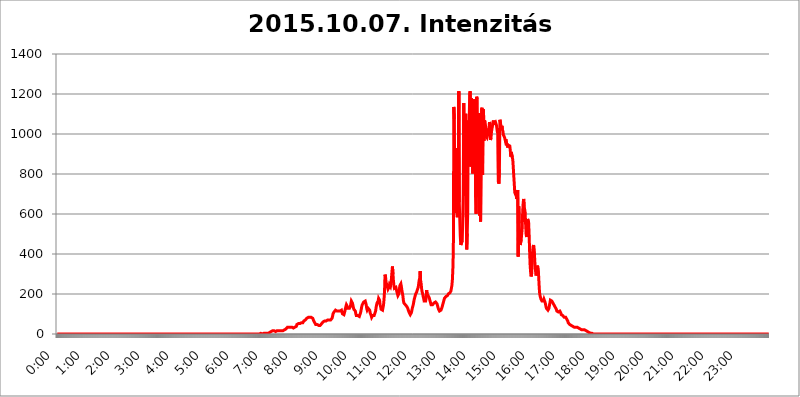
| Category | 2015.10.07. Intenzitás [W/m^2] |
|---|---|
| 0.0 | 0 |
| 0.0006944444444444445 | 0 |
| 0.001388888888888889 | 0 |
| 0.0020833333333333333 | 0 |
| 0.002777777777777778 | 0 |
| 0.003472222222222222 | 0 |
| 0.004166666666666667 | 0 |
| 0.004861111111111111 | 0 |
| 0.005555555555555556 | 0 |
| 0.0062499999999999995 | 0 |
| 0.006944444444444444 | 0 |
| 0.007638888888888889 | 0 |
| 0.008333333333333333 | 0 |
| 0.009027777777777779 | 0 |
| 0.009722222222222222 | 0 |
| 0.010416666666666666 | 0 |
| 0.011111111111111112 | 0 |
| 0.011805555555555555 | 0 |
| 0.012499999999999999 | 0 |
| 0.013194444444444444 | 0 |
| 0.013888888888888888 | 0 |
| 0.014583333333333332 | 0 |
| 0.015277777777777777 | 0 |
| 0.015972222222222224 | 0 |
| 0.016666666666666666 | 0 |
| 0.017361111111111112 | 0 |
| 0.018055555555555557 | 0 |
| 0.01875 | 0 |
| 0.019444444444444445 | 0 |
| 0.02013888888888889 | 0 |
| 0.020833333333333332 | 0 |
| 0.02152777777777778 | 0 |
| 0.022222222222222223 | 0 |
| 0.02291666666666667 | 0 |
| 0.02361111111111111 | 0 |
| 0.024305555555555556 | 0 |
| 0.024999999999999998 | 0 |
| 0.025694444444444447 | 0 |
| 0.02638888888888889 | 0 |
| 0.027083333333333334 | 0 |
| 0.027777777777777776 | 0 |
| 0.02847222222222222 | 0 |
| 0.029166666666666664 | 0 |
| 0.029861111111111113 | 0 |
| 0.030555555555555555 | 0 |
| 0.03125 | 0 |
| 0.03194444444444445 | 0 |
| 0.03263888888888889 | 0 |
| 0.03333333333333333 | 0 |
| 0.034027777777777775 | 0 |
| 0.034722222222222224 | 0 |
| 0.035416666666666666 | 0 |
| 0.036111111111111115 | 0 |
| 0.03680555555555556 | 0 |
| 0.0375 | 0 |
| 0.03819444444444444 | 0 |
| 0.03888888888888889 | 0 |
| 0.03958333333333333 | 0 |
| 0.04027777777777778 | 0 |
| 0.04097222222222222 | 0 |
| 0.041666666666666664 | 0 |
| 0.042361111111111106 | 0 |
| 0.04305555555555556 | 0 |
| 0.043750000000000004 | 0 |
| 0.044444444444444446 | 0 |
| 0.04513888888888889 | 0 |
| 0.04583333333333334 | 0 |
| 0.04652777777777778 | 0 |
| 0.04722222222222222 | 0 |
| 0.04791666666666666 | 0 |
| 0.04861111111111111 | 0 |
| 0.049305555555555554 | 0 |
| 0.049999999999999996 | 0 |
| 0.05069444444444445 | 0 |
| 0.051388888888888894 | 0 |
| 0.052083333333333336 | 0 |
| 0.05277777777777778 | 0 |
| 0.05347222222222222 | 0 |
| 0.05416666666666667 | 0 |
| 0.05486111111111111 | 0 |
| 0.05555555555555555 | 0 |
| 0.05625 | 0 |
| 0.05694444444444444 | 0 |
| 0.057638888888888885 | 0 |
| 0.05833333333333333 | 0 |
| 0.05902777777777778 | 0 |
| 0.059722222222222225 | 0 |
| 0.06041666666666667 | 0 |
| 0.061111111111111116 | 0 |
| 0.06180555555555556 | 0 |
| 0.0625 | 0 |
| 0.06319444444444444 | 0 |
| 0.06388888888888888 | 0 |
| 0.06458333333333334 | 0 |
| 0.06527777777777778 | 0 |
| 0.06597222222222222 | 0 |
| 0.06666666666666667 | 0 |
| 0.06736111111111111 | 0 |
| 0.06805555555555555 | 0 |
| 0.06874999999999999 | 0 |
| 0.06944444444444443 | 0 |
| 0.07013888888888889 | 0 |
| 0.07083333333333333 | 0 |
| 0.07152777777777779 | 0 |
| 0.07222222222222223 | 0 |
| 0.07291666666666667 | 0 |
| 0.07361111111111111 | 0 |
| 0.07430555555555556 | 0 |
| 0.075 | 0 |
| 0.07569444444444444 | 0 |
| 0.0763888888888889 | 0 |
| 0.07708333333333334 | 0 |
| 0.07777777777777778 | 0 |
| 0.07847222222222222 | 0 |
| 0.07916666666666666 | 0 |
| 0.0798611111111111 | 0 |
| 0.08055555555555556 | 0 |
| 0.08125 | 0 |
| 0.08194444444444444 | 0 |
| 0.08263888888888889 | 0 |
| 0.08333333333333333 | 0 |
| 0.08402777777777777 | 0 |
| 0.08472222222222221 | 0 |
| 0.08541666666666665 | 0 |
| 0.08611111111111112 | 0 |
| 0.08680555555555557 | 0 |
| 0.08750000000000001 | 0 |
| 0.08819444444444445 | 0 |
| 0.08888888888888889 | 0 |
| 0.08958333333333333 | 0 |
| 0.09027777777777778 | 0 |
| 0.09097222222222222 | 0 |
| 0.09166666666666667 | 0 |
| 0.09236111111111112 | 0 |
| 0.09305555555555556 | 0 |
| 0.09375 | 0 |
| 0.09444444444444444 | 0 |
| 0.09513888888888888 | 0 |
| 0.09583333333333333 | 0 |
| 0.09652777777777777 | 0 |
| 0.09722222222222222 | 0 |
| 0.09791666666666667 | 0 |
| 0.09861111111111111 | 0 |
| 0.09930555555555555 | 0 |
| 0.09999999999999999 | 0 |
| 0.10069444444444443 | 0 |
| 0.1013888888888889 | 0 |
| 0.10208333333333335 | 0 |
| 0.10277777777777779 | 0 |
| 0.10347222222222223 | 0 |
| 0.10416666666666667 | 0 |
| 0.10486111111111111 | 0 |
| 0.10555555555555556 | 0 |
| 0.10625 | 0 |
| 0.10694444444444444 | 0 |
| 0.1076388888888889 | 0 |
| 0.10833333333333334 | 0 |
| 0.10902777777777778 | 0 |
| 0.10972222222222222 | 0 |
| 0.1111111111111111 | 0 |
| 0.11180555555555556 | 0 |
| 0.11180555555555556 | 0 |
| 0.1125 | 0 |
| 0.11319444444444444 | 0 |
| 0.11388888888888889 | 0 |
| 0.11458333333333333 | 0 |
| 0.11527777777777777 | 0 |
| 0.11597222222222221 | 0 |
| 0.11666666666666665 | 0 |
| 0.1173611111111111 | 0 |
| 0.11805555555555557 | 0 |
| 0.11944444444444445 | 0 |
| 0.12013888888888889 | 0 |
| 0.12083333333333333 | 0 |
| 0.12152777777777778 | 0 |
| 0.12222222222222223 | 0 |
| 0.12291666666666667 | 0 |
| 0.12291666666666667 | 0 |
| 0.12361111111111112 | 0 |
| 0.12430555555555556 | 0 |
| 0.125 | 0 |
| 0.12569444444444444 | 0 |
| 0.12638888888888888 | 0 |
| 0.12708333333333333 | 0 |
| 0.16875 | 0 |
| 0.12847222222222224 | 0 |
| 0.12916666666666668 | 0 |
| 0.12986111111111112 | 0 |
| 0.13055555555555556 | 0 |
| 0.13125 | 0 |
| 0.13194444444444445 | 0 |
| 0.1326388888888889 | 0 |
| 0.13333333333333333 | 0 |
| 0.13402777777777777 | 0 |
| 0.13402777777777777 | 0 |
| 0.13472222222222222 | 0 |
| 0.13541666666666666 | 0 |
| 0.1361111111111111 | 0 |
| 0.13749999999999998 | 0 |
| 0.13819444444444443 | 0 |
| 0.1388888888888889 | 0 |
| 0.13958333333333334 | 0 |
| 0.14027777777777778 | 0 |
| 0.14097222222222222 | 0 |
| 0.14166666666666666 | 0 |
| 0.1423611111111111 | 0 |
| 0.14305555555555557 | 0 |
| 0.14375000000000002 | 0 |
| 0.14444444444444446 | 0 |
| 0.1451388888888889 | 0 |
| 0.1451388888888889 | 0 |
| 0.14652777777777778 | 0 |
| 0.14722222222222223 | 0 |
| 0.14791666666666667 | 0 |
| 0.1486111111111111 | 0 |
| 0.14930555555555555 | 0 |
| 0.15 | 0 |
| 0.15069444444444444 | 0 |
| 0.15138888888888888 | 0 |
| 0.15208333333333332 | 0 |
| 0.15277777777777776 | 0 |
| 0.15347222222222223 | 0 |
| 0.15416666666666667 | 0 |
| 0.15486111111111112 | 0 |
| 0.15555555555555556 | 0 |
| 0.15625 | 0 |
| 0.15694444444444444 | 0 |
| 0.15763888888888888 | 0 |
| 0.15833333333333333 | 0 |
| 0.15902777777777777 | 0 |
| 0.15972222222222224 | 0 |
| 0.16041666666666668 | 0 |
| 0.16111111111111112 | 0 |
| 0.16180555555555556 | 0 |
| 0.1625 | 0 |
| 0.16319444444444445 | 0 |
| 0.1638888888888889 | 0 |
| 0.16458333333333333 | 0 |
| 0.16527777777777777 | 0 |
| 0.16597222222222222 | 0 |
| 0.16666666666666666 | 0 |
| 0.1673611111111111 | 0 |
| 0.16805555555555554 | 0 |
| 0.16874999999999998 | 0 |
| 0.16944444444444443 | 0 |
| 0.17013888888888887 | 0 |
| 0.1708333333333333 | 0 |
| 0.17152777777777775 | 0 |
| 0.17222222222222225 | 0 |
| 0.1729166666666667 | 0 |
| 0.17361111111111113 | 0 |
| 0.17430555555555557 | 0 |
| 0.17500000000000002 | 0 |
| 0.17569444444444446 | 0 |
| 0.1763888888888889 | 0 |
| 0.17708333333333334 | 0 |
| 0.17777777777777778 | 0 |
| 0.17847222222222223 | 0 |
| 0.17916666666666667 | 0 |
| 0.1798611111111111 | 0 |
| 0.18055555555555555 | 0 |
| 0.18125 | 0 |
| 0.18194444444444444 | 0 |
| 0.1826388888888889 | 0 |
| 0.18333333333333335 | 0 |
| 0.1840277777777778 | 0 |
| 0.18472222222222223 | 0 |
| 0.18541666666666667 | 0 |
| 0.18611111111111112 | 0 |
| 0.18680555555555556 | 0 |
| 0.1875 | 0 |
| 0.18819444444444444 | 0 |
| 0.18888888888888888 | 0 |
| 0.18958333333333333 | 0 |
| 0.19027777777777777 | 0 |
| 0.1909722222222222 | 0 |
| 0.19166666666666665 | 0 |
| 0.19236111111111112 | 0 |
| 0.19305555555555554 | 0 |
| 0.19375 | 0 |
| 0.19444444444444445 | 0 |
| 0.1951388888888889 | 0 |
| 0.19583333333333333 | 0 |
| 0.19652777777777777 | 0 |
| 0.19722222222222222 | 0 |
| 0.19791666666666666 | 0 |
| 0.1986111111111111 | 0 |
| 0.19930555555555554 | 0 |
| 0.19999999999999998 | 0 |
| 0.20069444444444443 | 0 |
| 0.20138888888888887 | 0 |
| 0.2020833333333333 | 0 |
| 0.2027777777777778 | 0 |
| 0.2034722222222222 | 0 |
| 0.2041666666666667 | 0 |
| 0.20486111111111113 | 0 |
| 0.20555555555555557 | 0 |
| 0.20625000000000002 | 0 |
| 0.20694444444444446 | 0 |
| 0.2076388888888889 | 0 |
| 0.20833333333333334 | 0 |
| 0.20902777777777778 | 0 |
| 0.20972222222222223 | 0 |
| 0.21041666666666667 | 0 |
| 0.2111111111111111 | 0 |
| 0.21180555555555555 | 0 |
| 0.2125 | 0 |
| 0.21319444444444444 | 0 |
| 0.2138888888888889 | 0 |
| 0.21458333333333335 | 0 |
| 0.2152777777777778 | 0 |
| 0.21597222222222223 | 0 |
| 0.21666666666666667 | 0 |
| 0.21736111111111112 | 0 |
| 0.21805555555555556 | 0 |
| 0.21875 | 0 |
| 0.21944444444444444 | 0 |
| 0.22013888888888888 | 0 |
| 0.22083333333333333 | 0 |
| 0.22152777777777777 | 0 |
| 0.2222222222222222 | 0 |
| 0.22291666666666665 | 0 |
| 0.2236111111111111 | 0 |
| 0.22430555555555556 | 0 |
| 0.225 | 0 |
| 0.22569444444444445 | 0 |
| 0.2263888888888889 | 0 |
| 0.22708333333333333 | 0 |
| 0.22777777777777777 | 0 |
| 0.22847222222222222 | 0 |
| 0.22916666666666666 | 0 |
| 0.2298611111111111 | 0 |
| 0.23055555555555554 | 0 |
| 0.23124999999999998 | 0 |
| 0.23194444444444443 | 0 |
| 0.23263888888888887 | 0 |
| 0.2333333333333333 | 0 |
| 0.2340277777777778 | 0 |
| 0.2347222222222222 | 0 |
| 0.2354166666666667 | 0 |
| 0.23611111111111113 | 0 |
| 0.23680555555555557 | 0 |
| 0.23750000000000002 | 0 |
| 0.23819444444444446 | 0 |
| 0.2388888888888889 | 0 |
| 0.23958333333333334 | 0 |
| 0.24027777777777778 | 0 |
| 0.24097222222222223 | 0 |
| 0.24166666666666667 | 0 |
| 0.2423611111111111 | 0 |
| 0.24305555555555555 | 0 |
| 0.24375 | 0 |
| 0.24444444444444446 | 0 |
| 0.24513888888888888 | 0 |
| 0.24583333333333335 | 0 |
| 0.2465277777777778 | 0 |
| 0.24722222222222223 | 0 |
| 0.24791666666666667 | 0 |
| 0.24861111111111112 | 0 |
| 0.24930555555555556 | 0 |
| 0.25 | 0 |
| 0.25069444444444444 | 0 |
| 0.2513888888888889 | 0 |
| 0.2520833333333333 | 0 |
| 0.25277777777777777 | 0 |
| 0.2534722222222222 | 0 |
| 0.25416666666666665 | 0 |
| 0.2548611111111111 | 0 |
| 0.2555555555555556 | 0 |
| 0.25625000000000003 | 0 |
| 0.2569444444444445 | 0 |
| 0.2576388888888889 | 0 |
| 0.25833333333333336 | 0 |
| 0.2590277777777778 | 0 |
| 0.25972222222222224 | 0 |
| 0.2604166666666667 | 0 |
| 0.2611111111111111 | 0 |
| 0.26180555555555557 | 0 |
| 0.2625 | 0 |
| 0.26319444444444445 | 0 |
| 0.2638888888888889 | 0 |
| 0.26458333333333334 | 0 |
| 0.2652777777777778 | 0 |
| 0.2659722222222222 | 0 |
| 0.26666666666666666 | 0 |
| 0.2673611111111111 | 0 |
| 0.26805555555555555 | 0 |
| 0.26875 | 0 |
| 0.26944444444444443 | 0 |
| 0.2701388888888889 | 0 |
| 0.2708333333333333 | 0 |
| 0.27152777777777776 | 0 |
| 0.2722222222222222 | 0 |
| 0.27291666666666664 | 0 |
| 0.2736111111111111 | 0 |
| 0.2743055555555555 | 0 |
| 0.27499999999999997 | 0 |
| 0.27569444444444446 | 0 |
| 0.27638888888888885 | 0 |
| 0.27708333333333335 | 0 |
| 0.2777777777777778 | 0 |
| 0.27847222222222223 | 0 |
| 0.2791666666666667 | 0 |
| 0.2798611111111111 | 0 |
| 0.28055555555555556 | 0 |
| 0.28125 | 0 |
| 0.28194444444444444 | 0 |
| 0.2826388888888889 | 0 |
| 0.2833333333333333 | 0 |
| 0.28402777777777777 | 0 |
| 0.2847222222222222 | 0 |
| 0.28541666666666665 | 3.525 |
| 0.28611111111111115 | 3.525 |
| 0.28680555555555554 | 3.525 |
| 0.28750000000000003 | 0 |
| 0.2881944444444445 | 0 |
| 0.2888888888888889 | 3.525 |
| 0.28958333333333336 | 3.525 |
| 0.2902777777777778 | 3.525 |
| 0.29097222222222224 | 3.525 |
| 0.2916666666666667 | 3.525 |
| 0.2923611111111111 | 3.525 |
| 0.29305555555555557 | 3.525 |
| 0.29375 | 3.525 |
| 0.29444444444444445 | 3.525 |
| 0.2951388888888889 | 3.525 |
| 0.29583333333333334 | 3.525 |
| 0.2965277777777778 | 3.525 |
| 0.2972222222222222 | 7.887 |
| 0.29791666666666666 | 7.887 |
| 0.2986111111111111 | 7.887 |
| 0.29930555555555555 | 12.257 |
| 0.3 | 12.257 |
| 0.30069444444444443 | 12.257 |
| 0.3013888888888889 | 12.257 |
| 0.3020833333333333 | 16.636 |
| 0.30277777777777776 | 16.636 |
| 0.3034722222222222 | 16.636 |
| 0.30416666666666664 | 16.636 |
| 0.3048611111111111 | 16.636 |
| 0.3055555555555555 | 12.257 |
| 0.30624999999999997 | 12.257 |
| 0.3069444444444444 | 12.257 |
| 0.3076388888888889 | 12.257 |
| 0.30833333333333335 | 16.636 |
| 0.3090277777777778 | 16.636 |
| 0.30972222222222223 | 16.636 |
| 0.3104166666666667 | 16.636 |
| 0.3111111111111111 | 16.636 |
| 0.31180555555555556 | 16.636 |
| 0.3125 | 16.636 |
| 0.31319444444444444 | 16.636 |
| 0.3138888888888889 | 16.636 |
| 0.3145833333333333 | 16.636 |
| 0.31527777777777777 | 16.636 |
| 0.3159722222222222 | 16.636 |
| 0.31666666666666665 | 16.636 |
| 0.31736111111111115 | 16.636 |
| 0.31805555555555554 | 16.636 |
| 0.31875000000000003 | 21.024 |
| 0.3194444444444445 | 21.024 |
| 0.3201388888888889 | 25.419 |
| 0.32083333333333336 | 25.419 |
| 0.3215277777777778 | 29.823 |
| 0.32222222222222224 | 29.823 |
| 0.3229166666666667 | 34.234 |
| 0.3236111111111111 | 34.234 |
| 0.32430555555555557 | 34.234 |
| 0.325 | 34.234 |
| 0.32569444444444445 | 34.234 |
| 0.3263888888888889 | 34.234 |
| 0.32708333333333334 | 34.234 |
| 0.3277777777777778 | 34.234 |
| 0.3284722222222222 | 34.234 |
| 0.32916666666666666 | 34.234 |
| 0.3298611111111111 | 34.234 |
| 0.33055555555555555 | 34.234 |
| 0.33125 | 29.823 |
| 0.33194444444444443 | 34.234 |
| 0.3326388888888889 | 34.234 |
| 0.3333333333333333 | 34.234 |
| 0.3340277777777778 | 38.653 |
| 0.3347222222222222 | 38.653 |
| 0.3354166666666667 | 38.653 |
| 0.3361111111111111 | 47.511 |
| 0.3368055555555556 | 47.511 |
| 0.33749999999999997 | 51.951 |
| 0.33819444444444446 | 51.951 |
| 0.33888888888888885 | 51.951 |
| 0.33958333333333335 | 51.951 |
| 0.34027777777777773 | 51.951 |
| 0.34097222222222223 | 56.398 |
| 0.3416666666666666 | 56.398 |
| 0.3423611111111111 | 56.398 |
| 0.3430555555555555 | 56.398 |
| 0.34375 | 56.398 |
| 0.3444444444444445 | 56.398 |
| 0.3451388888888889 | 60.85 |
| 0.3458333333333334 | 65.31 |
| 0.34652777777777777 | 65.31 |
| 0.34722222222222227 | 65.31 |
| 0.34791666666666665 | 69.775 |
| 0.34861111111111115 | 69.775 |
| 0.34930555555555554 | 74.246 |
| 0.35000000000000003 | 78.722 |
| 0.3506944444444444 | 83.205 |
| 0.3513888888888889 | 83.205 |
| 0.3520833333333333 | 83.205 |
| 0.3527777777777778 | 83.205 |
| 0.3534722222222222 | 83.205 |
| 0.3541666666666667 | 83.205 |
| 0.3548611111111111 | 87.692 |
| 0.35555555555555557 | 87.692 |
| 0.35625 | 83.205 |
| 0.35694444444444445 | 83.205 |
| 0.3576388888888889 | 83.205 |
| 0.35833333333333334 | 78.722 |
| 0.3590277777777778 | 74.246 |
| 0.3597222222222222 | 65.31 |
| 0.36041666666666666 | 60.85 |
| 0.3611111111111111 | 56.398 |
| 0.36180555555555555 | 51.951 |
| 0.3625 | 47.511 |
| 0.36319444444444443 | 47.511 |
| 0.3638888888888889 | 47.511 |
| 0.3645833333333333 | 47.511 |
| 0.3652777777777778 | 47.511 |
| 0.3659722222222222 | 47.511 |
| 0.3666666666666667 | 43.079 |
| 0.3673611111111111 | 38.653 |
| 0.3680555555555556 | 38.653 |
| 0.36874999999999997 | 43.079 |
| 0.36944444444444446 | 47.511 |
| 0.37013888888888885 | 47.511 |
| 0.37083333333333335 | 51.951 |
| 0.37152777777777773 | 56.398 |
| 0.37222222222222223 | 56.398 |
| 0.3729166666666666 | 60.85 |
| 0.3736111111111111 | 60.85 |
| 0.3743055555555555 | 65.31 |
| 0.375 | 65.31 |
| 0.3756944444444445 | 65.31 |
| 0.3763888888888889 | 65.31 |
| 0.3770833333333334 | 65.31 |
| 0.37777777777777777 | 65.31 |
| 0.37847222222222227 | 65.31 |
| 0.37916666666666665 | 69.775 |
| 0.37986111111111115 | 74.246 |
| 0.38055555555555554 | 74.246 |
| 0.38125000000000003 | 69.775 |
| 0.3819444444444444 | 69.775 |
| 0.3826388888888889 | 69.775 |
| 0.3833333333333333 | 69.775 |
| 0.3840277777777778 | 74.246 |
| 0.3847222222222222 | 74.246 |
| 0.3854166666666667 | 78.722 |
| 0.3861111111111111 | 87.692 |
| 0.38680555555555557 | 101.184 |
| 0.3875 | 101.184 |
| 0.38819444444444445 | 110.201 |
| 0.3888888888888889 | 110.201 |
| 0.38958333333333334 | 114.716 |
| 0.3902777777777778 | 119.235 |
| 0.3909722222222222 | 119.235 |
| 0.39166666666666666 | 114.716 |
| 0.3923611111111111 | 114.716 |
| 0.39305555555555555 | 114.716 |
| 0.39375 | 110.201 |
| 0.39444444444444443 | 114.716 |
| 0.3951388888888889 | 114.716 |
| 0.3958333333333333 | 110.201 |
| 0.3965277777777778 | 114.716 |
| 0.3972222222222222 | 119.235 |
| 0.3979166666666667 | 119.235 |
| 0.3986111111111111 | 119.235 |
| 0.3993055555555556 | 110.201 |
| 0.39999999999999997 | 101.184 |
| 0.40069444444444446 | 96.682 |
| 0.40138888888888885 | 96.682 |
| 0.40208333333333335 | 96.682 |
| 0.40277777777777773 | 101.184 |
| 0.40347222222222223 | 114.716 |
| 0.4041666666666666 | 128.284 |
| 0.4048611111111111 | 137.347 |
| 0.4055555555555555 | 146.423 |
| 0.40625 | 150.964 |
| 0.4069444444444445 | 137.347 |
| 0.4076388888888889 | 128.284 |
| 0.4083333333333334 | 123.758 |
| 0.40902777777777777 | 123.758 |
| 0.40972222222222227 | 128.284 |
| 0.41041666666666665 | 128.284 |
| 0.41111111111111115 | 137.347 |
| 0.41180555555555554 | 150.964 |
| 0.41250000000000003 | 164.605 |
| 0.4131944444444444 | 164.605 |
| 0.4138888888888889 | 155.509 |
| 0.4145833333333333 | 146.423 |
| 0.4152777777777778 | 132.814 |
| 0.4159722222222222 | 123.758 |
| 0.4166666666666667 | 119.235 |
| 0.4173611111111111 | 119.235 |
| 0.41805555555555557 | 114.716 |
| 0.41875 | 101.184 |
| 0.41944444444444445 | 92.184 |
| 0.4201388888888889 | 87.692 |
| 0.42083333333333334 | 87.692 |
| 0.4215277777777778 | 92.184 |
| 0.4222222222222222 | 92.184 |
| 0.42291666666666666 | 92.184 |
| 0.4236111111111111 | 87.692 |
| 0.42430555555555555 | 87.692 |
| 0.425 | 92.184 |
| 0.42569444444444443 | 110.201 |
| 0.4263888888888889 | 123.758 |
| 0.4270833333333333 | 137.347 |
| 0.4277777777777778 | 146.423 |
| 0.4284722222222222 | 146.423 |
| 0.4291666666666667 | 150.964 |
| 0.4298611111111111 | 160.056 |
| 0.4305555555555556 | 164.605 |
| 0.43124999999999997 | 164.605 |
| 0.43194444444444446 | 164.605 |
| 0.43263888888888885 | 169.156 |
| 0.43333333333333335 | 146.423 |
| 0.43402777777777773 | 128.284 |
| 0.43472222222222223 | 119.235 |
| 0.4354166666666666 | 123.758 |
| 0.4361111111111111 | 128.284 |
| 0.4368055555555555 | 128.284 |
| 0.4375 | 128.284 |
| 0.4381944444444445 | 119.235 |
| 0.4388888888888889 | 105.69 |
| 0.4395833333333334 | 101.184 |
| 0.44027777777777777 | 92.184 |
| 0.44097222222222227 | 83.205 |
| 0.44166666666666665 | 87.692 |
| 0.44236111111111115 | 92.184 |
| 0.44305555555555554 | 96.682 |
| 0.44375000000000003 | 96.682 |
| 0.4444444444444444 | 92.184 |
| 0.4451388888888889 | 87.692 |
| 0.4458333333333333 | 96.682 |
| 0.4465277777777778 | 114.716 |
| 0.4472222222222222 | 132.814 |
| 0.4479166666666667 | 146.423 |
| 0.4486111111111111 | 155.509 |
| 0.44930555555555557 | 160.056 |
| 0.45 | 164.605 |
| 0.45069444444444445 | 178.264 |
| 0.4513888888888889 | 178.264 |
| 0.45208333333333334 | 169.156 |
| 0.4527777777777778 | 146.423 |
| 0.4534722222222222 | 137.347 |
| 0.45416666666666666 | 123.758 |
| 0.4548611111111111 | 119.235 |
| 0.45555555555555555 | 119.235 |
| 0.45625 | 119.235 |
| 0.45694444444444443 | 132.814 |
| 0.4576388888888889 | 146.423 |
| 0.4583333333333333 | 173.709 |
| 0.4590277777777778 | 214.746 |
| 0.4597222222222222 | 296.808 |
| 0.4604166666666667 | 287.709 |
| 0.4611111111111111 | 260.373 |
| 0.4618055555555556 | 251.251 |
| 0.46249999999999997 | 242.127 |
| 0.46319444444444446 | 237.564 |
| 0.46388888888888885 | 223.873 |
| 0.46458333333333335 | 228.436 |
| 0.46527777777777773 | 233 |
| 0.46597222222222223 | 246.689 |
| 0.4666666666666666 | 246.689 |
| 0.4673611111111111 | 237.564 |
| 0.4680555555555555 | 251.251 |
| 0.46875 | 278.603 |
| 0.4694444444444445 | 310.44 |
| 0.4701388888888889 | 337.639 |
| 0.4708333333333334 | 301.354 |
| 0.47152777777777777 | 264.932 |
| 0.47222222222222227 | 242.127 |
| 0.47291666666666665 | 228.436 |
| 0.47361111111111115 | 228.436 |
| 0.47430555555555554 | 228.436 |
| 0.47500000000000003 | 233 |
| 0.4756944444444444 | 228.436 |
| 0.4763888888888889 | 210.182 |
| 0.4770833333333333 | 201.058 |
| 0.4777777777777778 | 191.937 |
| 0.4784722222222222 | 187.378 |
| 0.4791666666666667 | 201.058 |
| 0.4798611111111111 | 223.873 |
| 0.48055555555555557 | 242.127 |
| 0.48125 | 246.689 |
| 0.48194444444444445 | 251.251 |
| 0.4826388888888889 | 237.564 |
| 0.48333333333333334 | 219.309 |
| 0.4840277777777778 | 205.62 |
| 0.4847222222222222 | 191.937 |
| 0.48541666666666666 | 169.156 |
| 0.4861111111111111 | 155.509 |
| 0.48680555555555555 | 155.509 |
| 0.4875 | 150.964 |
| 0.48819444444444443 | 146.423 |
| 0.4888888888888889 | 146.423 |
| 0.4895833333333333 | 141.884 |
| 0.4902777777777778 | 137.347 |
| 0.4909722222222222 | 132.814 |
| 0.4916666666666667 | 128.284 |
| 0.4923611111111111 | 119.235 |
| 0.4930555555555556 | 114.716 |
| 0.49374999999999997 | 105.69 |
| 0.49444444444444446 | 101.184 |
| 0.49513888888888885 | 96.682 |
| 0.49583333333333335 | 96.682 |
| 0.49652777777777773 | 105.69 |
| 0.49722222222222223 | 114.716 |
| 0.4979166666666666 | 128.284 |
| 0.4986111111111111 | 137.347 |
| 0.4993055555555555 | 146.423 |
| 0.5 | 160.056 |
| 0.5006944444444444 | 173.709 |
| 0.5013888888888889 | 182.82 |
| 0.5020833333333333 | 191.937 |
| 0.5027777777777778 | 201.058 |
| 0.5034722222222222 | 205.62 |
| 0.5041666666666667 | 210.182 |
| 0.5048611111111111 | 219.309 |
| 0.5055555555555555 | 223.873 |
| 0.50625 | 233 |
| 0.5069444444444444 | 251.251 |
| 0.5076388888888889 | 269.49 |
| 0.5083333333333333 | 278.603 |
| 0.5090277777777777 | 314.98 |
| 0.5097222222222222 | 260.373 |
| 0.5104166666666666 | 251.251 |
| 0.5111111111111112 | 223.873 |
| 0.5118055555555555 | 210.182 |
| 0.5125000000000001 | 201.058 |
| 0.5131944444444444 | 187.378 |
| 0.513888888888889 | 178.264 |
| 0.5145833333333333 | 164.605 |
| 0.5152777777777778 | 160.056 |
| 0.5159722222222222 | 160.056 |
| 0.5166666666666667 | 164.605 |
| 0.517361111111111 | 178.264 |
| 0.5180555555555556 | 219.309 |
| 0.5187499999999999 | 201.058 |
| 0.5194444444444445 | 201.058 |
| 0.5201388888888888 | 191.937 |
| 0.5208333333333334 | 187.378 |
| 0.5215277777777778 | 182.82 |
| 0.5222222222222223 | 178.264 |
| 0.5229166666666667 | 164.605 |
| 0.5236111111111111 | 155.509 |
| 0.5243055555555556 | 146.423 |
| 0.525 | 146.423 |
| 0.5256944444444445 | 146.423 |
| 0.5263888888888889 | 146.423 |
| 0.5270833333333333 | 146.423 |
| 0.5277777777777778 | 150.964 |
| 0.5284722222222222 | 155.509 |
| 0.5291666666666667 | 155.509 |
| 0.5298611111111111 | 160.056 |
| 0.5305555555555556 | 160.056 |
| 0.53125 | 155.509 |
| 0.5319444444444444 | 155.509 |
| 0.5326388888888889 | 150.964 |
| 0.5333333333333333 | 141.884 |
| 0.5340277777777778 | 132.814 |
| 0.5347222222222222 | 123.758 |
| 0.5354166666666667 | 119.235 |
| 0.5361111111111111 | 114.716 |
| 0.5368055555555555 | 110.201 |
| 0.5375 | 114.716 |
| 0.5381944444444444 | 119.235 |
| 0.5388888888888889 | 123.758 |
| 0.5395833333333333 | 132.814 |
| 0.5402777777777777 | 137.347 |
| 0.5409722222222222 | 150.964 |
| 0.5416666666666666 | 160.056 |
| 0.5423611111111112 | 169.156 |
| 0.5430555555555555 | 178.264 |
| 0.5437500000000001 | 182.82 |
| 0.5444444444444444 | 182.82 |
| 0.545138888888889 | 187.378 |
| 0.5458333333333333 | 187.378 |
| 0.5465277777777778 | 191.937 |
| 0.5472222222222222 | 191.937 |
| 0.5479166666666667 | 196.497 |
| 0.548611111111111 | 201.058 |
| 0.5493055555555556 | 201.058 |
| 0.5499999999999999 | 205.62 |
| 0.5506944444444445 | 205.62 |
| 0.5513888888888888 | 210.182 |
| 0.5520833333333334 | 214.746 |
| 0.5527777777777778 | 228.436 |
| 0.5534722222222223 | 242.127 |
| 0.5541666666666667 | 269.49 |
| 0.5548611111111111 | 324.052 |
| 0.5555555555555556 | 422.943 |
| 0.55625 | 1135.543 |
| 0.5569444444444445 | 1074.789 |
| 0.5576388888888889 | 629.948 |
| 0.5583333333333333 | 604.864 |
| 0.5590277777777778 | 613.252 |
| 0.5597222222222222 | 928.819 |
| 0.5604166666666667 | 675.311 |
| 0.5611111111111111 | 583.779 |
| 0.5618055555555556 | 743.859 |
| 0.5625 | 711.832 |
| 0.5631944444444444 | 1213.804 |
| 0.5638888888888889 | 658.909 |
| 0.5645833333333333 | 571.049 |
| 0.5652777777777778 | 489.108 |
| 0.5659722222222222 | 445.129 |
| 0.5666666666666667 | 440.702 |
| 0.5673611111111111 | 445.129 |
| 0.5680555555555555 | 467.187 |
| 0.56875 | 467.187 |
| 0.5694444444444444 | 699.717 |
| 0.5701388888888889 | 1154.814 |
| 0.5708333333333333 | 755.766 |
| 0.5715277777777777 | 691.608 |
| 0.5722222222222222 | 775.492 |
| 0.5729166666666666 | 1101.226 |
| 0.5736111111111112 | 583.779 |
| 0.5743055555555555 | 422.943 |
| 0.5750000000000001 | 502.192 |
| 0.5756944444444444 | 609.062 |
| 0.576388888888889 | 1067.267 |
| 0.5770833333333333 | 856.855 |
| 0.5777777777777778 | 1063.51 |
| 0.5784722222222222 | 1201.843 |
| 0.5791666666666667 | 1213.804 |
| 0.579861111111111 | 837.682 |
| 0.5805555555555556 | 1178.177 |
| 0.5812499999999999 | 1170.358 |
| 0.5819444444444445 | 1158.689 |
| 0.5826388888888888 | 802.868 |
| 0.5833333333333334 | 1026.06 |
| 0.5840277777777778 | 1158.689 |
| 0.5847222222222223 | 1174.263 |
| 0.5854166666666667 | 1147.086 |
| 0.5861111111111111 | 1170.358 |
| 0.5868055555555556 | 683.473 |
| 0.5875 | 600.661 |
| 0.5881944444444445 | 1186.03 |
| 0.5888888888888889 | 1174.263 |
| 0.5895833333333333 | 1178.177 |
| 0.5902777777777778 | 687.544 |
| 0.5909722222222222 | 1105.019 |
| 0.5916666666666667 | 679.395 |
| 0.5923611111111111 | 592.233 |
| 0.5930555555555556 | 642.4 |
| 0.59375 | 562.53 |
| 0.5944444444444444 | 879.719 |
| 0.5951388888888889 | 1124.056 |
| 0.5958333333333333 | 1131.708 |
| 0.5965277777777778 | 795.074 |
| 0.5972222222222222 | 1124.056 |
| 0.5979166666666667 | 1112.618 |
| 0.5986111111111111 | 966.295 |
| 0.5993055555555555 | 1067.267 |
| 0.6 | 1059.756 |
| 0.6006944444444444 | 1041.019 |
| 0.6013888888888889 | 988.714 |
| 0.6020833333333333 | 988.714 |
| 0.6027777777777777 | 981.244 |
| 0.6034722222222222 | 984.98 |
| 0.6041666666666666 | 984.98 |
| 0.6048611111111112 | 1014.852 |
| 0.6055555555555555 | 1033.537 |
| 0.6062500000000001 | 1059.756 |
| 0.6069444444444444 | 1048.508 |
| 0.607638888888889 | 970.034 |
| 0.6083333333333333 | 981.244 |
| 0.6090277777777778 | 1011.118 |
| 0.6097222222222222 | 1026.06 |
| 0.6104166666666667 | 1041.019 |
| 0.611111111111111 | 1059.756 |
| 0.6118055555555556 | 1067.267 |
| 0.6124999999999999 | 1052.255 |
| 0.6131944444444445 | 1052.255 |
| 0.6138888888888888 | 1052.255 |
| 0.6145833333333334 | 1059.756 |
| 0.6152777777777778 | 1059.756 |
| 0.6159722222222223 | 1044.762 |
| 0.6166666666666667 | 1026.06 |
| 0.6173611111111111 | 1007.383 |
| 0.6180555555555556 | 1029.798 |
| 0.61875 | 759.723 |
| 0.6194444444444445 | 751.803 |
| 0.6201388888888889 | 822.26 |
| 0.6208333333333333 | 1071.027 |
| 0.6215277777777778 | 1059.756 |
| 0.6222222222222222 | 1041.019 |
| 0.6229166666666667 | 1022.323 |
| 0.6236111111111111 | 1041.019 |
| 0.6243055555555556 | 1022.323 |
| 0.625 | 1014.852 |
| 0.6256944444444444 | 996.182 |
| 0.6263888888888889 | 992.448 |
| 0.6270833333333333 | 984.98 |
| 0.6277777777777778 | 977.508 |
| 0.6284722222222222 | 966.295 |
| 0.6291666666666667 | 973.772 |
| 0.6298611111111111 | 970.034 |
| 0.6305555555555555 | 943.832 |
| 0.63125 | 951.327 |
| 0.6319444444444444 | 932.576 |
| 0.6326388888888889 | 943.832 |
| 0.6333333333333333 | 940.082 |
| 0.6340277777777777 | 947.58 |
| 0.6347222222222222 | 940.082 |
| 0.6354166666666666 | 917.534 |
| 0.6361111111111112 | 887.309 |
| 0.6368055555555555 | 909.996 |
| 0.6375000000000001 | 909.996 |
| 0.6381944444444444 | 883.516 |
| 0.638888888888889 | 872.114 |
| 0.6395833333333333 | 833.834 |
| 0.6402777777777778 | 791.169 |
| 0.6409722222222222 | 751.803 |
| 0.6416666666666667 | 707.8 |
| 0.642361111111111 | 703.762 |
| 0.6430555555555556 | 695.666 |
| 0.6437499999999999 | 703.762 |
| 0.6444444444444445 | 675.311 |
| 0.6451388888888888 | 703.762 |
| 0.6458333333333334 | 719.877 |
| 0.6465277777777778 | 387.202 |
| 0.6472222222222223 | 638.256 |
| 0.6479166666666667 | 553.986 |
| 0.6486111111111111 | 489.108 |
| 0.6493055555555556 | 445.129 |
| 0.65 | 445.129 |
| 0.6506944444444445 | 471.582 |
| 0.6513888888888889 | 471.582 |
| 0.6520833333333333 | 528.2 |
| 0.6527777777777778 | 609.062 |
| 0.6534722222222222 | 654.791 |
| 0.6541666666666667 | 675.311 |
| 0.6548611111111111 | 638.256 |
| 0.6555555555555556 | 634.105 |
| 0.65625 | 609.062 |
| 0.6569444444444444 | 545.416 |
| 0.6576388888888889 | 497.836 |
| 0.6583333333333333 | 484.735 |
| 0.6590277777777778 | 519.555 |
| 0.6597222222222222 | 575.299 |
| 0.6604166666666667 | 575.299 |
| 0.6611111111111111 | 558.261 |
| 0.6618055555555555 | 497.836 |
| 0.6625 | 414.035 |
| 0.6631944444444444 | 346.682 |
| 0.6638888888888889 | 310.44 |
| 0.6645833333333333 | 287.709 |
| 0.6652777777777777 | 296.808 |
| 0.6659722222222222 | 342.162 |
| 0.6666666666666666 | 409.574 |
| 0.6673611111111111 | 436.27 |
| 0.6680555555555556 | 445.129 |
| 0.6687500000000001 | 440.702 |
| 0.6694444444444444 | 387.202 |
| 0.6701388888888888 | 342.162 |
| 0.6708333333333334 | 314.98 |
| 0.6715277777777778 | 292.259 |
| 0.6722222222222222 | 301.354 |
| 0.6729166666666666 | 319.517 |
| 0.6736111111111112 | 342.162 |
| 0.6743055555555556 | 342.162 |
| 0.6749999999999999 | 301.354 |
| 0.6756944444444444 | 251.251 |
| 0.6763888888888889 | 210.182 |
| 0.6770833333333334 | 191.937 |
| 0.6777777777777777 | 182.82 |
| 0.6784722222222223 | 173.709 |
| 0.6791666666666667 | 173.709 |
| 0.6798611111111111 | 164.605 |
| 0.6805555555555555 | 164.605 |
| 0.68125 | 164.605 |
| 0.6819444444444445 | 164.605 |
| 0.6826388888888889 | 173.709 |
| 0.6833333333333332 | 169.156 |
| 0.6840277777777778 | 160.056 |
| 0.6847222222222222 | 150.964 |
| 0.6854166666666667 | 137.347 |
| 0.686111111111111 | 128.284 |
| 0.6868055555555556 | 123.758 |
| 0.6875 | 123.758 |
| 0.6881944444444444 | 119.235 |
| 0.688888888888889 | 119.235 |
| 0.6895833333333333 | 128.284 |
| 0.6902777777777778 | 141.884 |
| 0.6909722222222222 | 155.509 |
| 0.6916666666666668 | 169.156 |
| 0.6923611111111111 | 164.605 |
| 0.6930555555555555 | 164.605 |
| 0.69375 | 164.605 |
| 0.6944444444444445 | 160.056 |
| 0.6951388888888889 | 155.509 |
| 0.6958333333333333 | 150.964 |
| 0.6965277777777777 | 146.423 |
| 0.6972222222222223 | 141.884 |
| 0.6979166666666666 | 137.347 |
| 0.6986111111111111 | 137.347 |
| 0.6993055555555556 | 132.814 |
| 0.7000000000000001 | 123.758 |
| 0.7006944444444444 | 114.716 |
| 0.7013888888888888 | 110.201 |
| 0.7020833333333334 | 110.201 |
| 0.7027777777777778 | 110.201 |
| 0.7034722222222222 | 110.201 |
| 0.7041666666666666 | 114.716 |
| 0.7048611111111112 | 114.716 |
| 0.7055555555555556 | 110.201 |
| 0.7062499999999999 | 105.69 |
| 0.7069444444444444 | 96.682 |
| 0.7076388888888889 | 92.184 |
| 0.7083333333333334 | 92.184 |
| 0.7090277777777777 | 92.184 |
| 0.7097222222222223 | 87.692 |
| 0.7104166666666667 | 87.692 |
| 0.7111111111111111 | 83.205 |
| 0.7118055555555555 | 83.205 |
| 0.7125 | 83.205 |
| 0.7131944444444445 | 83.205 |
| 0.7138888888888889 | 78.722 |
| 0.7145833333333332 | 74.246 |
| 0.7152777777777778 | 69.775 |
| 0.7159722222222222 | 65.31 |
| 0.7166666666666667 | 56.398 |
| 0.717361111111111 | 56.398 |
| 0.7180555555555556 | 51.951 |
| 0.71875 | 47.511 |
| 0.7194444444444444 | 47.511 |
| 0.720138888888889 | 47.511 |
| 0.7208333333333333 | 43.079 |
| 0.7215277777777778 | 43.079 |
| 0.7222222222222222 | 38.653 |
| 0.7229166666666668 | 38.653 |
| 0.7236111111111111 | 38.653 |
| 0.7243055555555555 | 34.234 |
| 0.725 | 34.234 |
| 0.7256944444444445 | 34.234 |
| 0.7263888888888889 | 34.234 |
| 0.7270833333333333 | 34.234 |
| 0.7277777777777777 | 34.234 |
| 0.7284722222222223 | 34.234 |
| 0.7291666666666666 | 34.234 |
| 0.7298611111111111 | 29.823 |
| 0.7305555555555556 | 29.823 |
| 0.7312500000000001 | 29.823 |
| 0.7319444444444444 | 29.823 |
| 0.7326388888888888 | 25.419 |
| 0.7333333333333334 | 25.419 |
| 0.7340277777777778 | 25.419 |
| 0.7347222222222222 | 25.419 |
| 0.7354166666666666 | 21.024 |
| 0.7361111111111112 | 21.024 |
| 0.7368055555555556 | 21.024 |
| 0.7374999999999999 | 21.024 |
| 0.7381944444444444 | 21.024 |
| 0.7388888888888889 | 21.024 |
| 0.7395833333333334 | 21.024 |
| 0.7402777777777777 | 21.024 |
| 0.7409722222222223 | 21.024 |
| 0.7416666666666667 | 16.636 |
| 0.7423611111111111 | 16.636 |
| 0.7430555555555555 | 12.257 |
| 0.74375 | 12.257 |
| 0.7444444444444445 | 7.887 |
| 0.7451388888888889 | 7.887 |
| 0.7458333333333332 | 7.887 |
| 0.7465277777777778 | 3.525 |
| 0.7472222222222222 | 3.525 |
| 0.7479166666666667 | 3.525 |
| 0.748611111111111 | 3.525 |
| 0.7493055555555556 | 3.525 |
| 0.75 | 3.525 |
| 0.7506944444444444 | 0 |
| 0.751388888888889 | 0 |
| 0.7520833333333333 | 0 |
| 0.7527777777777778 | 0 |
| 0.7534722222222222 | 0 |
| 0.7541666666666668 | 0 |
| 0.7548611111111111 | 0 |
| 0.7555555555555555 | 0 |
| 0.75625 | 0 |
| 0.7569444444444445 | 0 |
| 0.7576388888888889 | 0 |
| 0.7583333333333333 | 0 |
| 0.7590277777777777 | 0 |
| 0.7597222222222223 | 0 |
| 0.7604166666666666 | 0 |
| 0.7611111111111111 | 0 |
| 0.7618055555555556 | 0 |
| 0.7625000000000001 | 0 |
| 0.7631944444444444 | 0 |
| 0.7638888888888888 | 0 |
| 0.7645833333333334 | 0 |
| 0.7652777777777778 | 0 |
| 0.7659722222222222 | 0 |
| 0.7666666666666666 | 0 |
| 0.7673611111111112 | 0 |
| 0.7680555555555556 | 0 |
| 0.7687499999999999 | 0 |
| 0.7694444444444444 | 0 |
| 0.7701388888888889 | 0 |
| 0.7708333333333334 | 0 |
| 0.7715277777777777 | 0 |
| 0.7722222222222223 | 0 |
| 0.7729166666666667 | 0 |
| 0.7736111111111111 | 0 |
| 0.7743055555555555 | 0 |
| 0.775 | 0 |
| 0.7756944444444445 | 0 |
| 0.7763888888888889 | 0 |
| 0.7770833333333332 | 0 |
| 0.7777777777777778 | 0 |
| 0.7784722222222222 | 0 |
| 0.7791666666666667 | 0 |
| 0.779861111111111 | 0 |
| 0.7805555555555556 | 0 |
| 0.78125 | 0 |
| 0.7819444444444444 | 0 |
| 0.782638888888889 | 0 |
| 0.7833333333333333 | 0 |
| 0.7840277777777778 | 0 |
| 0.7847222222222222 | 0 |
| 0.7854166666666668 | 0 |
| 0.7861111111111111 | 0 |
| 0.7868055555555555 | 0 |
| 0.7875 | 0 |
| 0.7881944444444445 | 0 |
| 0.7888888888888889 | 0 |
| 0.7895833333333333 | 0 |
| 0.7902777777777777 | 0 |
| 0.7909722222222223 | 0 |
| 0.7916666666666666 | 0 |
| 0.7923611111111111 | 0 |
| 0.7930555555555556 | 0 |
| 0.7937500000000001 | 0 |
| 0.7944444444444444 | 0 |
| 0.7951388888888888 | 0 |
| 0.7958333333333334 | 0 |
| 0.7965277777777778 | 0 |
| 0.7972222222222222 | 0 |
| 0.7979166666666666 | 0 |
| 0.7986111111111112 | 0 |
| 0.7993055555555556 | 0 |
| 0.7999999999999999 | 0 |
| 0.8006944444444444 | 0 |
| 0.8013888888888889 | 0 |
| 0.8020833333333334 | 0 |
| 0.8027777777777777 | 0 |
| 0.8034722222222223 | 0 |
| 0.8041666666666667 | 0 |
| 0.8048611111111111 | 0 |
| 0.8055555555555555 | 0 |
| 0.80625 | 0 |
| 0.8069444444444445 | 0 |
| 0.8076388888888889 | 0 |
| 0.8083333333333332 | 0 |
| 0.8090277777777778 | 0 |
| 0.8097222222222222 | 0 |
| 0.8104166666666667 | 0 |
| 0.811111111111111 | 0 |
| 0.8118055555555556 | 0 |
| 0.8125 | 0 |
| 0.8131944444444444 | 0 |
| 0.813888888888889 | 0 |
| 0.8145833333333333 | 0 |
| 0.8152777777777778 | 0 |
| 0.8159722222222222 | 0 |
| 0.8166666666666668 | 0 |
| 0.8173611111111111 | 0 |
| 0.8180555555555555 | 0 |
| 0.81875 | 0 |
| 0.8194444444444445 | 0 |
| 0.8201388888888889 | 0 |
| 0.8208333333333333 | 0 |
| 0.8215277777777777 | 0 |
| 0.8222222222222223 | 0 |
| 0.8229166666666666 | 0 |
| 0.8236111111111111 | 0 |
| 0.8243055555555556 | 0 |
| 0.8250000000000001 | 0 |
| 0.8256944444444444 | 0 |
| 0.8263888888888888 | 0 |
| 0.8270833333333334 | 0 |
| 0.8277777777777778 | 0 |
| 0.8284722222222222 | 0 |
| 0.8291666666666666 | 0 |
| 0.8298611111111112 | 0 |
| 0.8305555555555556 | 0 |
| 0.8312499999999999 | 0 |
| 0.8319444444444444 | 0 |
| 0.8326388888888889 | 0 |
| 0.8333333333333334 | 0 |
| 0.8340277777777777 | 0 |
| 0.8347222222222223 | 0 |
| 0.8354166666666667 | 0 |
| 0.8361111111111111 | 0 |
| 0.8368055555555555 | 0 |
| 0.8375 | 0 |
| 0.8381944444444445 | 0 |
| 0.8388888888888889 | 0 |
| 0.8395833333333332 | 0 |
| 0.8402777777777778 | 0 |
| 0.8409722222222222 | 0 |
| 0.8416666666666667 | 0 |
| 0.842361111111111 | 0 |
| 0.8430555555555556 | 0 |
| 0.84375 | 0 |
| 0.8444444444444444 | 0 |
| 0.845138888888889 | 0 |
| 0.8458333333333333 | 0 |
| 0.8465277777777778 | 0 |
| 0.8472222222222222 | 0 |
| 0.8479166666666668 | 0 |
| 0.8486111111111111 | 0 |
| 0.8493055555555555 | 0 |
| 0.85 | 0 |
| 0.8506944444444445 | 0 |
| 0.8513888888888889 | 0 |
| 0.8520833333333333 | 0 |
| 0.8527777777777777 | 0 |
| 0.8534722222222223 | 0 |
| 0.8541666666666666 | 0 |
| 0.8548611111111111 | 0 |
| 0.8555555555555556 | 0 |
| 0.8562500000000001 | 0 |
| 0.8569444444444444 | 0 |
| 0.8576388888888888 | 0 |
| 0.8583333333333334 | 0 |
| 0.8590277777777778 | 0 |
| 0.8597222222222222 | 0 |
| 0.8604166666666666 | 0 |
| 0.8611111111111112 | 0 |
| 0.8618055555555556 | 0 |
| 0.8624999999999999 | 0 |
| 0.8631944444444444 | 0 |
| 0.8638888888888889 | 0 |
| 0.8645833333333334 | 0 |
| 0.8652777777777777 | 0 |
| 0.8659722222222223 | 0 |
| 0.8666666666666667 | 0 |
| 0.8673611111111111 | 0 |
| 0.8680555555555555 | 0 |
| 0.86875 | 0 |
| 0.8694444444444445 | 0 |
| 0.8701388888888889 | 0 |
| 0.8708333333333332 | 0 |
| 0.8715277777777778 | 0 |
| 0.8722222222222222 | 0 |
| 0.8729166666666667 | 0 |
| 0.873611111111111 | 0 |
| 0.8743055555555556 | 0 |
| 0.875 | 0 |
| 0.8756944444444444 | 0 |
| 0.876388888888889 | 0 |
| 0.8770833333333333 | 0 |
| 0.8777777777777778 | 0 |
| 0.8784722222222222 | 0 |
| 0.8791666666666668 | 0 |
| 0.8798611111111111 | 0 |
| 0.8805555555555555 | 0 |
| 0.88125 | 0 |
| 0.8819444444444445 | 0 |
| 0.8826388888888889 | 0 |
| 0.8833333333333333 | 0 |
| 0.8840277777777777 | 0 |
| 0.8847222222222223 | 0 |
| 0.8854166666666666 | 0 |
| 0.8861111111111111 | 0 |
| 0.8868055555555556 | 0 |
| 0.8875000000000001 | 0 |
| 0.8881944444444444 | 0 |
| 0.8888888888888888 | 0 |
| 0.8895833333333334 | 0 |
| 0.8902777777777778 | 0 |
| 0.8909722222222222 | 0 |
| 0.8916666666666666 | 0 |
| 0.8923611111111112 | 0 |
| 0.8930555555555556 | 0 |
| 0.8937499999999999 | 0 |
| 0.8944444444444444 | 0 |
| 0.8951388888888889 | 0 |
| 0.8958333333333334 | 0 |
| 0.8965277777777777 | 0 |
| 0.8972222222222223 | 0 |
| 0.8979166666666667 | 0 |
| 0.8986111111111111 | 0 |
| 0.8993055555555555 | 0 |
| 0.9 | 0 |
| 0.9006944444444445 | 0 |
| 0.9013888888888889 | 0 |
| 0.9020833333333332 | 0 |
| 0.9027777777777778 | 0 |
| 0.9034722222222222 | 0 |
| 0.9041666666666667 | 0 |
| 0.904861111111111 | 0 |
| 0.9055555555555556 | 0 |
| 0.90625 | 0 |
| 0.9069444444444444 | 0 |
| 0.907638888888889 | 0 |
| 0.9083333333333333 | 0 |
| 0.9090277777777778 | 0 |
| 0.9097222222222222 | 0 |
| 0.9104166666666668 | 0 |
| 0.9111111111111111 | 0 |
| 0.9118055555555555 | 0 |
| 0.9125 | 0 |
| 0.9131944444444445 | 0 |
| 0.9138888888888889 | 0 |
| 0.9145833333333333 | 0 |
| 0.9152777777777777 | 0 |
| 0.9159722222222223 | 0 |
| 0.9166666666666666 | 0 |
| 0.9173611111111111 | 0 |
| 0.9180555555555556 | 0 |
| 0.9187500000000001 | 0 |
| 0.9194444444444444 | 0 |
| 0.9201388888888888 | 0 |
| 0.9208333333333334 | 0 |
| 0.9215277777777778 | 0 |
| 0.9222222222222222 | 0 |
| 0.9229166666666666 | 0 |
| 0.9236111111111112 | 0 |
| 0.9243055555555556 | 0 |
| 0.9249999999999999 | 0 |
| 0.9256944444444444 | 0 |
| 0.9263888888888889 | 0 |
| 0.9270833333333334 | 0 |
| 0.9277777777777777 | 0 |
| 0.9284722222222223 | 0 |
| 0.9291666666666667 | 0 |
| 0.9298611111111111 | 0 |
| 0.9305555555555555 | 0 |
| 0.93125 | 0 |
| 0.9319444444444445 | 0 |
| 0.9326388888888889 | 0 |
| 0.9333333333333332 | 0 |
| 0.9340277777777778 | 0 |
| 0.9347222222222222 | 0 |
| 0.9354166666666667 | 0 |
| 0.936111111111111 | 0 |
| 0.9368055555555556 | 0 |
| 0.9375 | 0 |
| 0.9381944444444444 | 0 |
| 0.938888888888889 | 0 |
| 0.9395833333333333 | 0 |
| 0.9402777777777778 | 0 |
| 0.9409722222222222 | 0 |
| 0.9416666666666668 | 0 |
| 0.9423611111111111 | 0 |
| 0.9430555555555555 | 0 |
| 0.94375 | 0 |
| 0.9444444444444445 | 0 |
| 0.9451388888888889 | 0 |
| 0.9458333333333333 | 0 |
| 0.9465277777777777 | 0 |
| 0.9472222222222223 | 0 |
| 0.9479166666666666 | 0 |
| 0.9486111111111111 | 0 |
| 0.9493055555555556 | 0 |
| 0.9500000000000001 | 0 |
| 0.9506944444444444 | 0 |
| 0.9513888888888888 | 0 |
| 0.9520833333333334 | 0 |
| 0.9527777777777778 | 0 |
| 0.9534722222222222 | 0 |
| 0.9541666666666666 | 0 |
| 0.9548611111111112 | 0 |
| 0.9555555555555556 | 0 |
| 0.9562499999999999 | 0 |
| 0.9569444444444444 | 0 |
| 0.9576388888888889 | 0 |
| 0.9583333333333334 | 0 |
| 0.9590277777777777 | 0 |
| 0.9597222222222223 | 0 |
| 0.9604166666666667 | 0 |
| 0.9611111111111111 | 0 |
| 0.9618055555555555 | 0 |
| 0.9625 | 0 |
| 0.9631944444444445 | 0 |
| 0.9638888888888889 | 0 |
| 0.9645833333333332 | 0 |
| 0.9652777777777778 | 0 |
| 0.9659722222222222 | 0 |
| 0.9666666666666667 | 0 |
| 0.967361111111111 | 0 |
| 0.9680555555555556 | 0 |
| 0.96875 | 0 |
| 0.9694444444444444 | 0 |
| 0.970138888888889 | 0 |
| 0.9708333333333333 | 0 |
| 0.9715277777777778 | 0 |
| 0.9722222222222222 | 0 |
| 0.9729166666666668 | 0 |
| 0.9736111111111111 | 0 |
| 0.9743055555555555 | 0 |
| 0.975 | 0 |
| 0.9756944444444445 | 0 |
| 0.9763888888888889 | 0 |
| 0.9770833333333333 | 0 |
| 0.9777777777777777 | 0 |
| 0.9784722222222223 | 0 |
| 0.9791666666666666 | 0 |
| 0.9798611111111111 | 0 |
| 0.9805555555555556 | 0 |
| 0.9812500000000001 | 0 |
| 0.9819444444444444 | 0 |
| 0.9826388888888888 | 0 |
| 0.9833333333333334 | 0 |
| 0.9840277777777778 | 0 |
| 0.9847222222222222 | 0 |
| 0.9854166666666666 | 0 |
| 0.9861111111111112 | 0 |
| 0.9868055555555556 | 0 |
| 0.9874999999999999 | 0 |
| 0.9881944444444444 | 0 |
| 0.9888888888888889 | 0 |
| 0.9895833333333334 | 0 |
| 0.9902777777777777 | 0 |
| 0.9909722222222223 | 0 |
| 0.9916666666666667 | 0 |
| 0.9923611111111111 | 0 |
| 0.9930555555555555 | 0 |
| 0.99375 | 0 |
| 0.9944444444444445 | 0 |
| 0.9951388888888889 | 0 |
| 0.9958333333333332 | 0 |
| 0.9965277777777778 | 0 |
| 0.9972222222222222 | 0 |
| 0.9979166666666667 | 0 |
| 0.998611111111111 | 0 |
| 0.9993055555555556 | 0 |